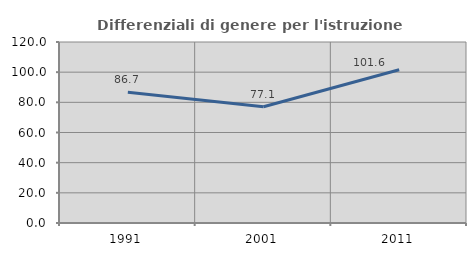
| Category | Differenziali di genere per l'istruzione superiore |
|---|---|
| 1991.0 | 86.749 |
| 2001.0 | 77.075 |
| 2011.0 | 101.647 |